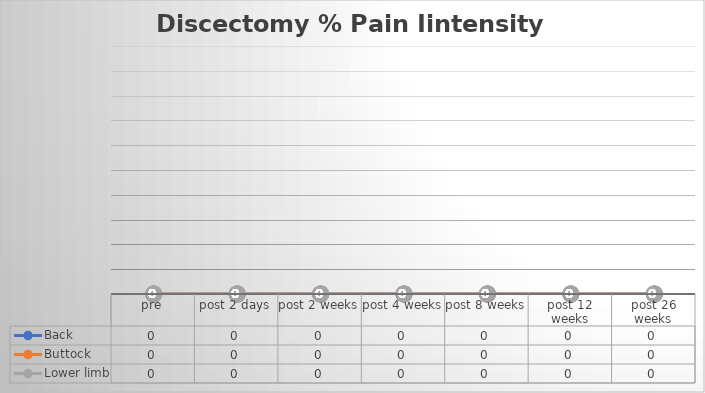
| Category | Back | Buttock | Lower limb |
|---|---|---|---|
| pre | 0 | 0 | 0 |
| post 2 days | 0 | 0 | 0 |
| post 2 weeks | 0 | 0 | 0 |
| post 4 weeks | 0 | 0 | 0 |
| post 8 weeks | 0 | 0 | 0 |
| post 12 weeks | 0 | 0 | 0 |
| post 26 weeks | 0 | 0 | 0 |